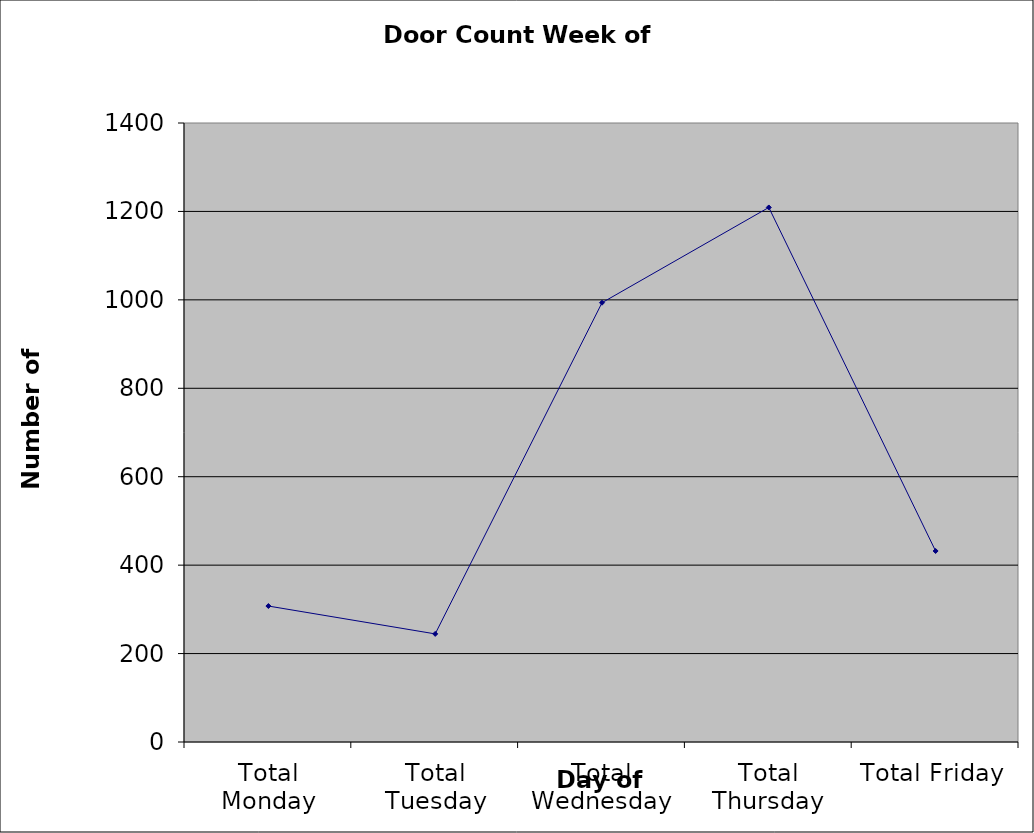
| Category | Series 0 |
|---|---|
| Total Monday | 307.5 |
| Total Tuesday | 244.5 |
| Total Wednesday | 993.5 |
| Total Thursday | 1209 |
| Total Friday | 432 |